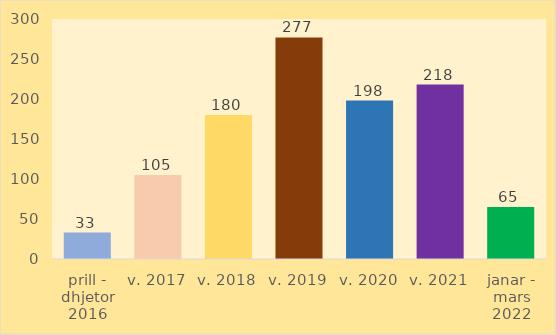
| Category | Numri i lejeve Ndërtime të reja |
|---|---|
| prill - dhjetor 2016 | 33 |
| v. 2017 | 105 |
| v. 2018 | 180 |
| v. 2019 | 277 |
| v. 2020 | 198 |
| v. 2021 | 218 |
| janar - mars 2022 | 65 |